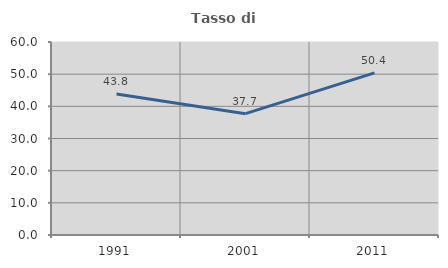
| Category | Tasso di occupazione   |
|---|---|
| 1991.0 | 43.81 |
| 2001.0 | 37.725 |
| 2011.0 | 50.388 |